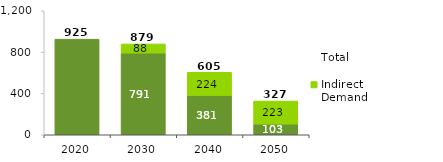
| Category | Direct Demand | Indirect Demand | Total |
|---|---|---|---|
| 2020.0 | 925.386 | 0 | 925.386 |
| 2030.0 | 791.115 | 87.814 | 878.93 |
| 2040.0 | 380.717 | 224.064 | 604.781 |
| 2050.0 | 103.493 | 223.308 | 326.801 |